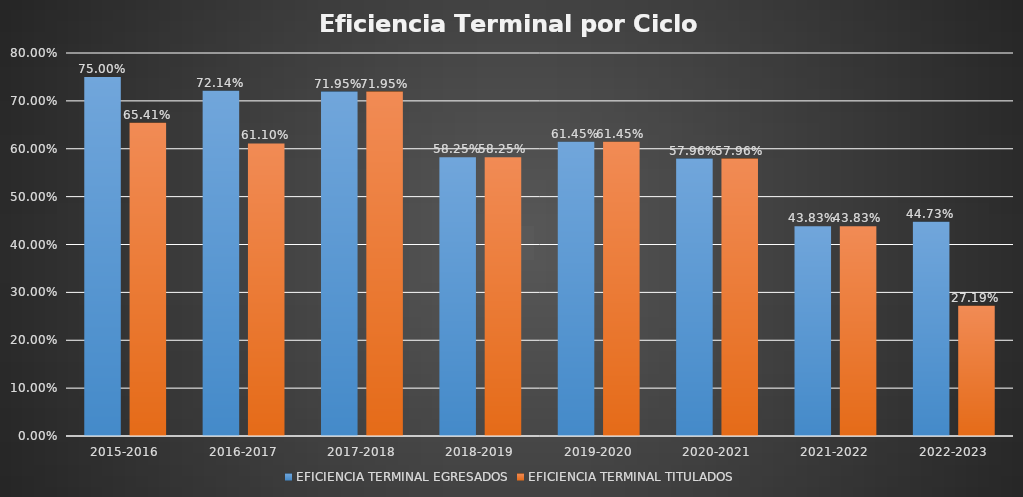
| Category | EFICIENCIA TERMINAL EGRESADOS | EFICIENCIA TERMINAL TITULADOS |
|---|---|---|
| 2015-2016 | 0.75 | 0.654 |
| 2016-2017 | 0.721 | 0.611 |
| 2017-2018 | 0.72 | 0.72 |
| 2018-2019 | 0.582 | 0.582 |
| 2019-2020 | 0.614 | 0.614 |
| 2020-2021 | 0.58 | 0.58 |
| 2021-2022 | 0.438 | 0.438 |
| 2022-2023 | 0.447 | 0.272 |